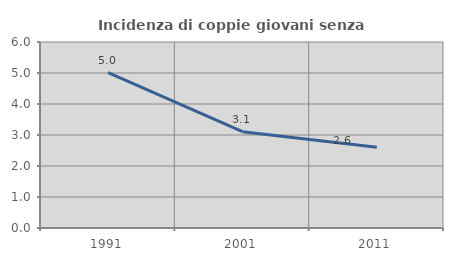
| Category | Incidenza di coppie giovani senza figli |
|---|---|
| 1991.0 | 5.008 |
| 2001.0 | 3.108 |
| 2011.0 | 2.605 |